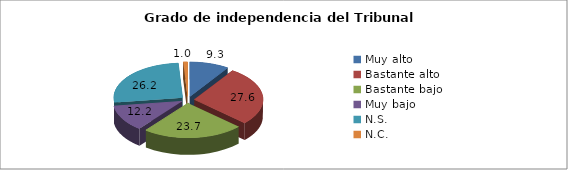
| Category | % |
|---|---|
| Muy alto | 9.3 |
| Bastante alto | 27.6 |
| Bastante bajo | 23.7 |
| Muy bajo  | 12.2 |
| N.S.  | 26.2 |
| N.C.  | 1 |